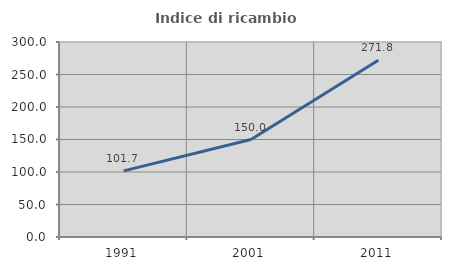
| Category | Indice di ricambio occupazionale  |
|---|---|
| 1991.0 | 101.667 |
| 2001.0 | 150 |
| 2011.0 | 271.831 |